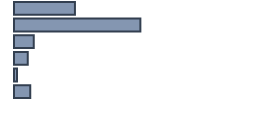
| Category | Percentatge |
|---|---|
| 0 | 25.391 |
| 1 | 52.652 |
| 2 | 8.261 |
| 3 | 5.696 |
| 4 | 1.217 |
| 5 | 6.783 |